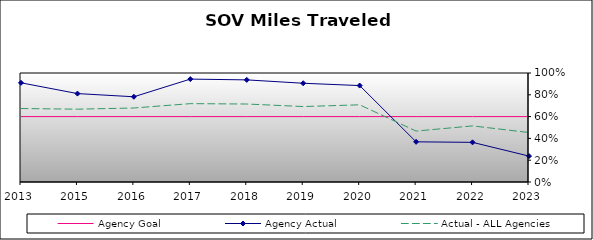
| Category | Agency Goal | Agency Actual | Actual - ALL Agencies |
|---|---|---|---|
| 2013.0 | 0.6 | 0.91 | 0.674 |
| 2015.0 | 0.6 | 0.811 | 0.668 |
| 2016.0 | 0.6 | 0.782 | 0.679 |
| 2017.0 | 0.6 | 0.944 | 0.719 |
| 2018.0 | 0.6 | 0.937 | 0.715 |
| 2019.0 | 0.6 | 0.906 | 0.692 |
| 2020.0 | 0.6 | 0.885 | 0.708 |
| 2021.0 | 0.6 | 0.368 | 0.467 |
| 2022.0 | 0.6 | 0.364 | 0.515 |
| 2023.0 | 0.6 | 0.238 | 0.454 |